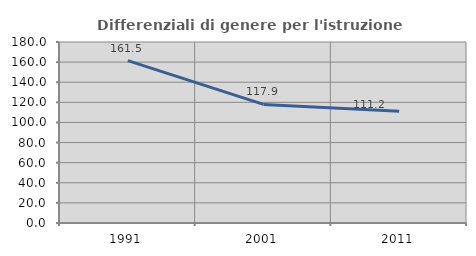
| Category | Differenziali di genere per l'istruzione superiore |
|---|---|
| 1991.0 | 161.498 |
| 2001.0 | 117.914 |
| 2011.0 | 111.162 |